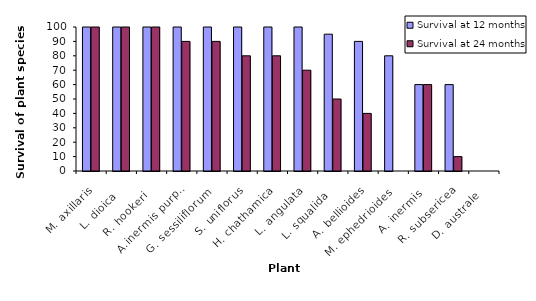
| Category | Survival at 12 months | Survival at 24 months |
|---|---|---|
| M. axillaris | 100 | 100 |
| L. dioica  | 100 | 100 |
| R. hookeri  | 100 | 100 |
| A.inermis purpurea | 100 | 90 |
| G. sessiliflorum | 100 | 90 |
| S. uniflorus | 100 | 80 |
| H. chathamica | 100 | 80 |
| L. angulata | 100 | 70 |
| L. squalida  | 95 | 50 |
| A. bellioides | 90 | 40 |
| M. ephedrioides | 80 | 0 |
| A. inermis  | 60 | 60 |
| R. subsericea | 60 | 10 |
| D. australe  | 0 | 0 |